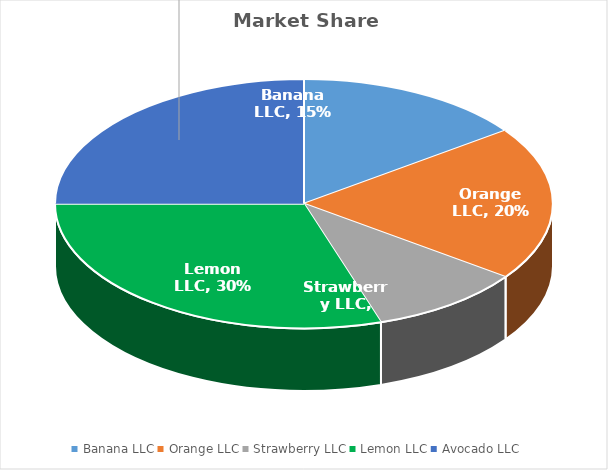
| Category | Market Share |
|---|---|
| Banana LLC | 0.15 |
| Orange LLC | 0.2 |
| Strawberry LLC | 0.1 |
| Lemon LLC | 0.3 |
| Avocado LLC | 0.25 |